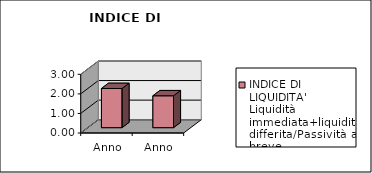
| Category | INDICE DI LIQUIDITA'
Liquidità immediata+liquidità differita/Passività a breve |
|---|---|
| Anno 2023 | 2.003 |
| Anno 2022 | 1.63 |